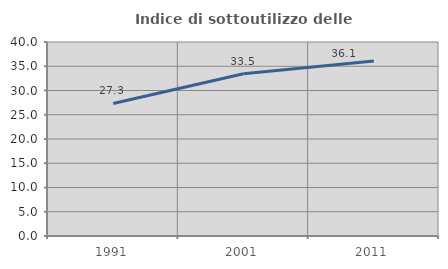
| Category | Indice di sottoutilizzo delle abitazioni  |
|---|---|
| 1991.0 | 27.329 |
| 2001.0 | 33.451 |
| 2011.0 | 36.091 |